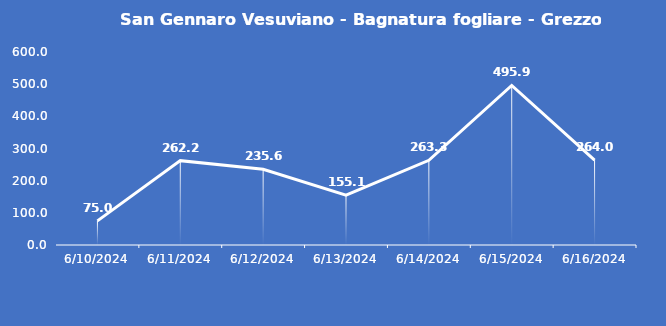
| Category | San Gennaro Vesuviano - Bagnatura fogliare - Grezzo (min) |
|---|---|
| 6/10/24 | 75 |
| 6/11/24 | 262.2 |
| 6/12/24 | 235.6 |
| 6/13/24 | 155.1 |
| 6/14/24 | 263.3 |
| 6/15/24 | 495.9 |
| 6/16/24 | 264 |